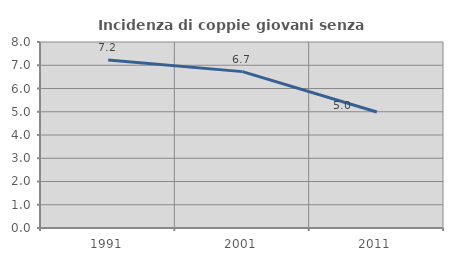
| Category | Incidenza di coppie giovani senza figli |
|---|---|
| 1991.0 | 7.227 |
| 2001.0 | 6.726 |
| 2011.0 | 4.988 |